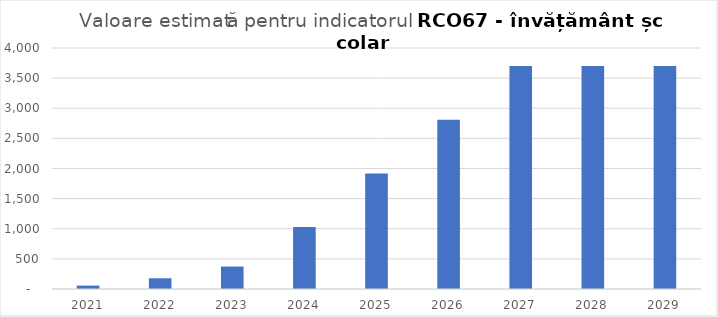
| Category | Series 0 |
|---|---|
| 2021.0 | 56.667 |
| 2022.0 | 178.097 |
| 2023.0 | 372.384 |
| 2024.0 | 1028.103 |
| 2025.0 | 1918.585 |
| 2026.0 | 2809.068 |
| 2027.0 | 3699.55 |
| 2028.0 | 3699.55 |
| 2029.0 | 3699.55 |